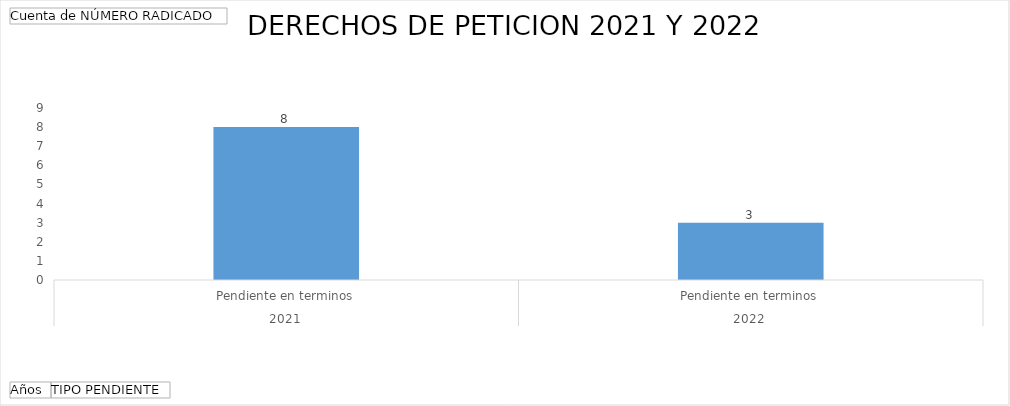
| Category | Total |
|---|---|
| 0 | 8 |
| 1 | 3 |